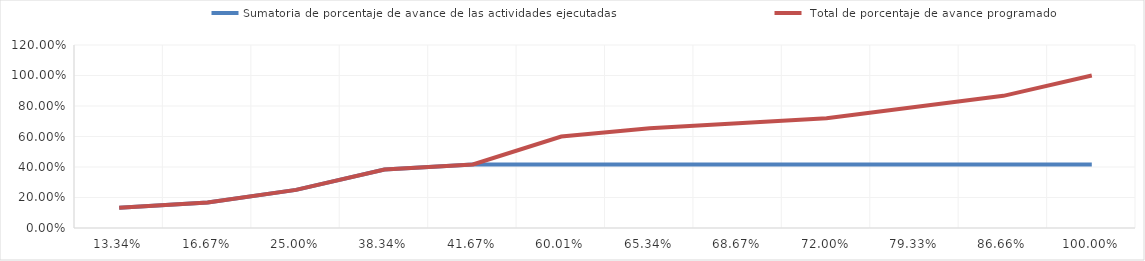
| Category | Sumatoria de porcentaje de avance de las actividades ejecutadas |  Total de porcentaje de avance programado |
|---|---|---|
| 0.1334 | 0.133 | 0.133 |
| 0.1667 | 0.167 | 0.167 |
| 0.25 | 0.25 | 0.25 |
| 0.38339999999999996 | 0.383 | 0.383 |
| 0.41669999999999996 | 0.417 | 0.417 |
| 0.6001 | 0.417 | 0.6 |
| 0.6534 | 0.417 | 0.653 |
| 0.6867 | 0.417 | 0.687 |
| 0.72 | 0.417 | 0.72 |
| 0.7933 | 0.417 | 0.793 |
| 0.8666 | 0.417 | 0.867 |
| 1.0 | 0.417 | 1 |